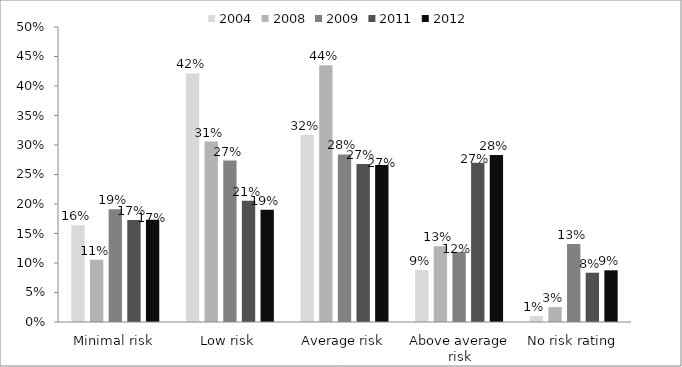
| Category | 2004 | 2008 | 2009 | 2011 | 2012 |
|---|---|---|---|---|---|
| Minimal risk | 0.164 | 0.106 | 0.191 | 0.173 | 0.173 |
| Low risk | 0.421 | 0.306 | 0.274 | 0.206 | 0.19 |
| Average risk | 0.317 | 0.435 | 0.284 | 0.268 | 0.266 |
| Above average risk | 0.088 | 0.128 | 0.119 | 0.27 | 0.283 |
| No risk rating | 0.01 | 0.025 | 0.132 | 0.083 | 0.088 |